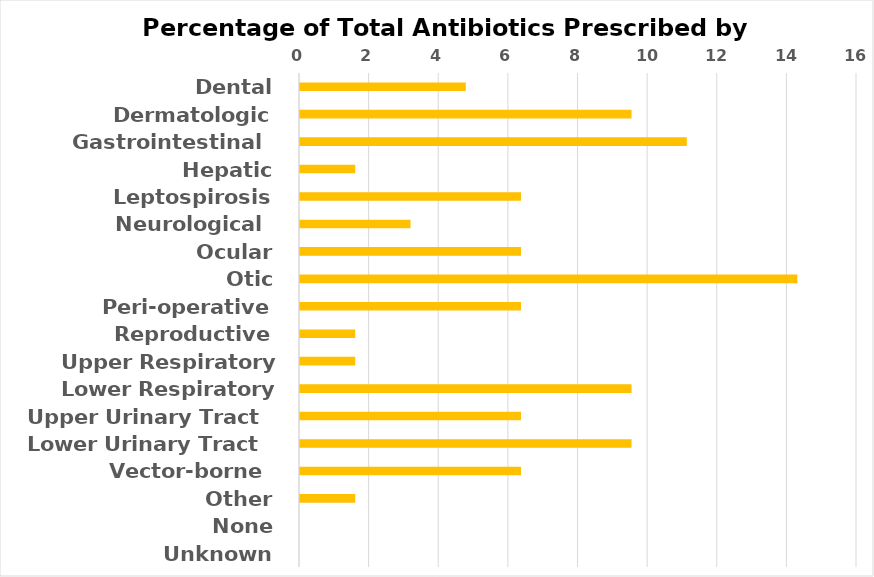
| Category | 0 |
|---|---|
| Dental | 4.762 |
| Dermatologic | 9.524 |
| Gastrointestinal  | 11.111 |
| Hepatic | 1.587 |
| Leptospirosis | 6.349 |
| Neurological  | 3.175 |
| Ocular | 6.349 |
| Otic | 14.286 |
| Peri-operative | 6.349 |
| Reproductive | 1.587 |
| Upper Respiratory Tract  | 1.587 |
| Lower Respiratory Tract  | 9.524 |
| Upper Urinary Tract  | 6.349 |
| Lower Urinary Tract  | 9.524 |
| Vector-borne  | 6.349 |
| Other | 1.587 |
| None | 0 |
| Unknown | 0 |